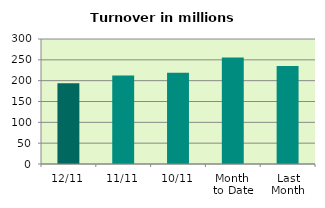
| Category | Series 0 |
|---|---|
| 12/11 | 194.04 |
| 11/11 | 212.621 |
| 10/11 | 218.82 |
| Month 
to Date | 255.562 |
| Last
Month | 235.36 |